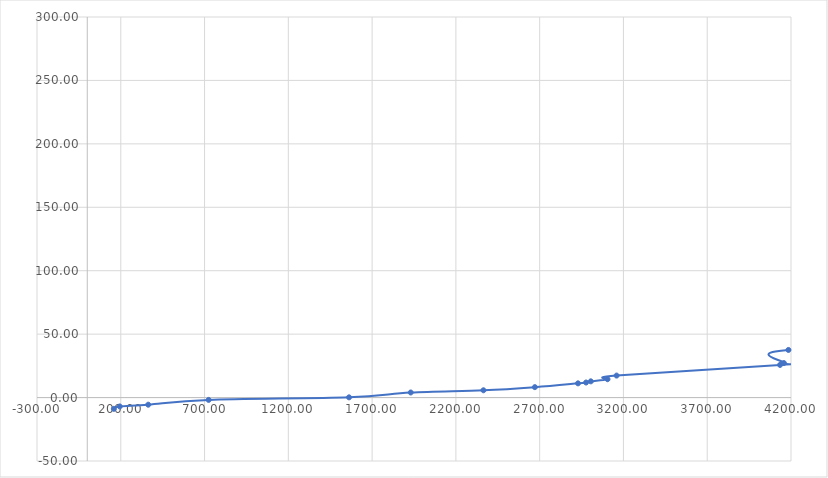
| Category | Total Levelized Cost ($/kW-yr) |
|---|---|
| 158.5717533777168 | -8.892 |
| 193.8099207949872 | -6.997 |
| 363.79447019378824 | -5.622 |
| 724.3544054797885 | -1.83 |
| 1562.2434055862154 | 0.18 |
| 1930.4675919352035 | 4.006 |
| 2364.446097275082 | 5.751 |
| 2671.3547141905256 | 8.219 |
| 2928.8327095840673 | 11.213 |
| 2976.9796023621943 | 11.873 |
| 3005.2676476391193 | 12.804 |
| 3104.875790260884 | 14.474 |
| 3158.979929150668 | 17.338 |
| 4134.485744348417 | 25.731 |
| 4157.487876967032 | 27.211 |
| 4184.639621447151 | 37.532 |
| 5691.562320772089 | 42.797 |
| 5891.007972153331 | 66.461 |
| 6074.189979115429 | 76.532 |
| 6089.356325723548 | 81.763 |
| 6310.009355754067 | 131.001 |
| 6331.806724816937 | 166.108 |
| 6333.73002208719 | 264.152 |